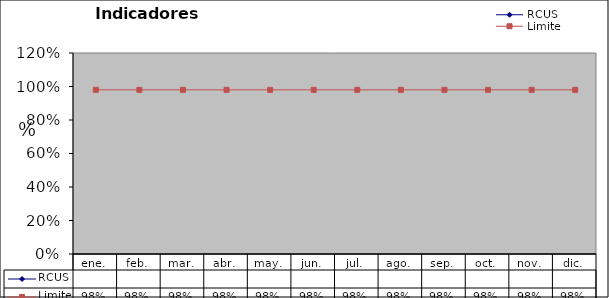
| Category | RCUS | Limite |
|---|---|---|
| ene. |  | 0.98 |
| feb. |  | 0.98 |
| mar. |  | 0.98 |
| abr. |  | 0.98 |
| may. |  | 0.98 |
| jun. |  | 0.98 |
| jul. |  | 0.98 |
| ago. |  | 0.98 |
| sep. |  | 0.98 |
| oct. |  | 0.98 |
| nov. |  | 0.98 |
| dic. |  | 0.98 |